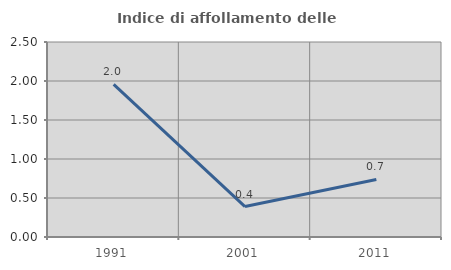
| Category | Indice di affollamento delle abitazioni  |
|---|---|
| 1991.0 | 1.957 |
| 2001.0 | 0.39 |
| 2011.0 | 0.738 |